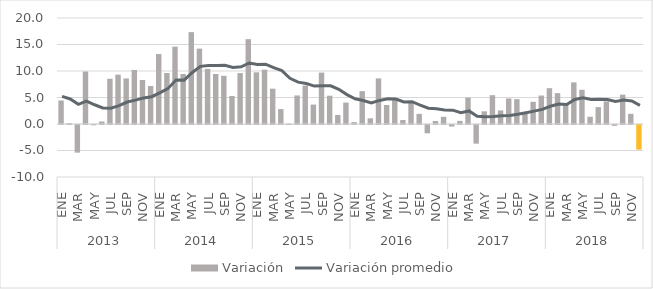
| Category | Variación |
|---|---|
| 0 | 4.431 |
| 1 | 0.15 |
| 2 | -5.212 |
| 3 | 9.899 |
| 4 | -0.053 |
| 5 | 0.469 |
| 6 | 8.53 |
| 7 | 9.314 |
| 8 | 8.593 |
| 9 | 10.204 |
| 10 | 8.297 |
| 11 | 7.174 |
| 12 | 13.196 |
| 13 | 9.616 |
| 14 | 14.596 |
| 15 | 9.438 |
| 16 | 17.333 |
| 17 | 14.218 |
| 18 | 10.397 |
| 19 | 9.439 |
| 20 | 9.086 |
| 21 | 5.281 |
| 22 | 9.604 |
| 23 | 16.007 |
| 24 | 9.751 |
| 25 | 10.246 |
| 26 | 6.662 |
| 27 | 2.811 |
| 28 | 0.053 |
| 29 | 5.383 |
| 30 | 7.248 |
| 31 | 3.667 |
| 32 | 9.703 |
| 33 | 5.336 |
| 34 | 1.708 |
| 35 | 4.044 |
| 36 | 0.354 |
| 37 | 6.199 |
| 38 | 1.068 |
| 39 | 8.607 |
| 40 | 3.588 |
| 41 | 4.889 |
| 42 | 0.753 |
| 43 | 4.216 |
| 44 | 1.91 |
| 45 | -1.567 |
| 46 | 0.562 |
| 47 | 1.353 |
| 48 | -0.29 |
| 49 | 0.587 |
| 50 | 4.971 |
| 51 | -3.519 |
| 52 | 2.39 |
| 53 | 5.437 |
| 54 | 2.563 |
| 55 | 4.814 |
| 56 | 4.692 |
| 57 | 1.935 |
| 58 | 4.185 |
| 59 | 5.374 |
| 60 | 6.755 |
| 61 | 5.823 |
| 62 | 3.738 |
| 63 | 7.855 |
| 64 | 6.455 |
| 65 | 1.367 |
| 66 | 3.186 |
| 67 | 4.261 |
| 68 | -0.157 |
| 69 | 5.537 |
| 70 | 1.919 |
| 71 | -4.651 |